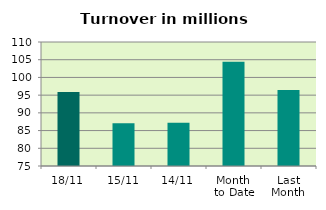
| Category | Series 0 |
|---|---|
| 18/11 | 95.906 |
| 15/11 | 87.091 |
| 14/11 | 87.224 |
| Month 
to Date | 104.454 |
| Last
Month | 96.433 |